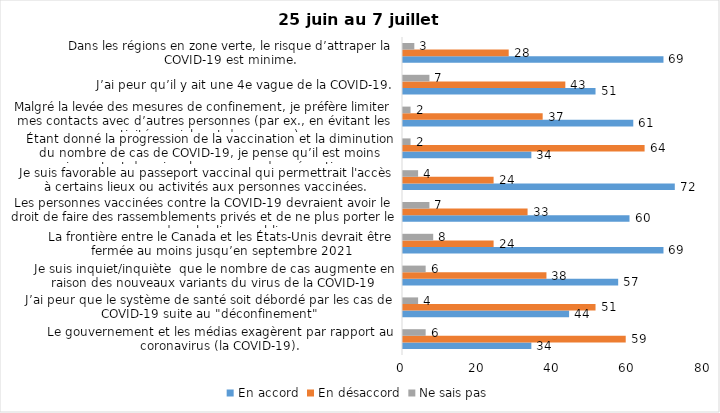
| Category | En accord | En désaccord | Ne sais pas |
|---|---|---|---|
| Le gouvernement et les médias exagèrent par rapport au coronavirus (la COVID-19). | 34 | 59 | 6 |
| J’ai peur que le système de santé soit débordé par les cas de COVID-19 suite au "déconfinement" | 44 | 51 | 4 |
| Je suis inquiet/inquiète  que le nombre de cas augmente en raison des nouveaux variants du virus de la COVID-19 | 57 | 38 | 6 |
| La frontière entre le Canada et les États-Unis devrait être fermée au moins jusqu’en septembre 2021 | 69 | 24 | 8 |
| Les personnes vaccinées contre la COVID-19 devraient avoir le droit de faire des rassemblements privés et de ne plus porter le masque dans les lieux publics. | 60 | 33 | 7 |
| Je suis favorable au passeport vaccinal qui permettrait l'accès à certains lieux ou activités aux personnes vaccinées. | 72 | 24 | 4 |
| Étant donné la progression de la vaccination et la diminution du nombre de cas de COVID-19, je pense qu’il est moins important de suivre les mesures de prévention. | 34 | 64 | 2 |
| Malgré la levée des mesures de confinement, je préfère limiter mes contacts avec d’autres personnes (par ex., en évitant les activités sociales et de groupes) | 61 | 37 | 2 |
| J’ai peur qu’il y ait une 4e vague de la COVID-19. | 51 | 43 | 7 |
| Dans les régions en zone verte, le risque d’attraper la COVID-19 est minime. | 69 | 28 | 3 |